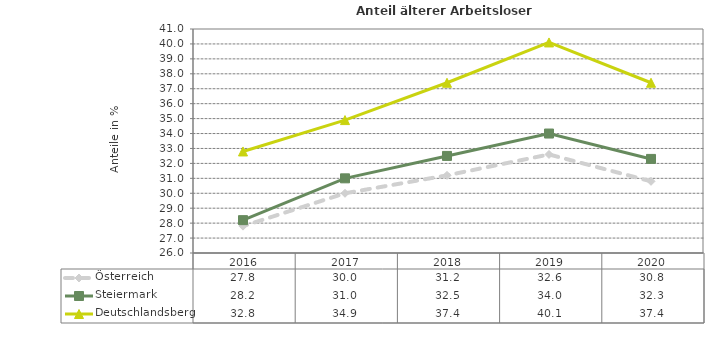
| Category | Österreich | Steiermark | Deutschlandsberg |
|---|---|---|---|
| 2020.0 | 30.8 | 32.3 | 37.4 |
| 2019.0 | 32.6 | 34 | 40.1 |
| 2018.0 | 31.2 | 32.5 | 37.4 |
| 2017.0 | 30 | 31 | 34.9 |
| 2016.0 | 27.8 | 28.2 | 32.8 |